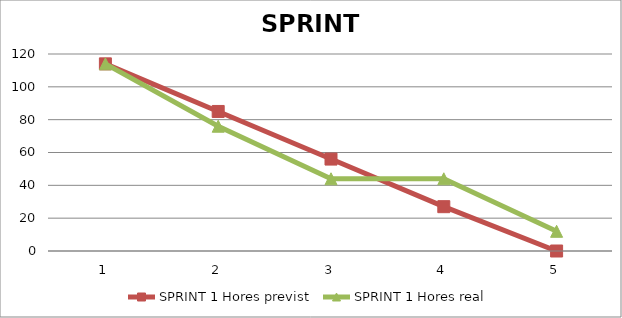
| Category | SPRINT 1 Hores previst | SPRINT 1 Hores real |
|---|---|---|
| 0 | 114 | 114 |
| 1 | 85 | 76 |
| 2 | 56 | 44 |
| 3 | 27 | 44 |
| 4 | 0 | 12 |